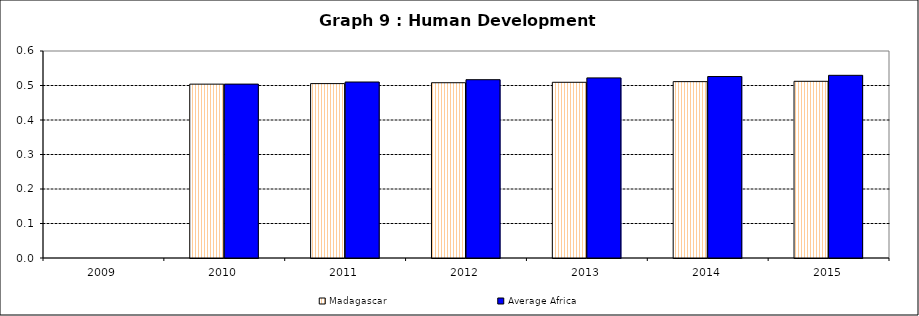
| Category | Madagascar | Average Africa |
|---|---|---|
| 2009.0 | 0 | 0 |
| 2010.0 | 0.504 | 0.504 |
| 2011.0 | 0.506 | 0.51 |
| 2012.0 | 0.508 | 0.517 |
| 2013.0 | 0.509 | 0.522 |
| 2014.0 | 0.511 | 0.526 |
| 2015.0 | 0.512 | 0.53 |